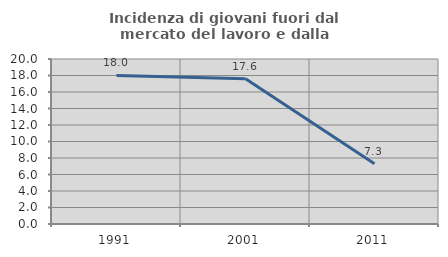
| Category | Incidenza di giovani fuori dal mercato del lavoro e dalla formazione  |
|---|---|
| 1991.0 | 18.009 |
| 2001.0 | 17.608 |
| 2011.0 | 7.299 |